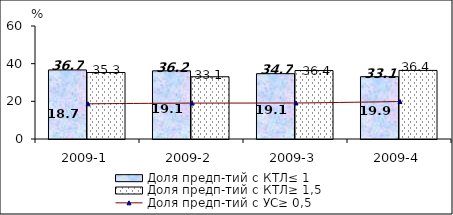
| Category | Доля предп-тий с КТЛ≤ 1 | Доля предп-тий с КТЛ≥ 1,5 |
|---|---|---|
| 2009-1 | 36.676 | 35.313 |
| 2009-2 | 36.196 | 33.05 |
| 2009-3 | 34.694 | 36.355 |
| 2009-4 | 33.091 | 36.421 |